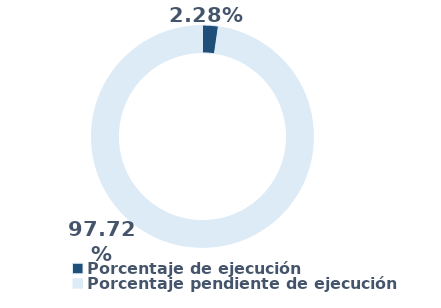
| Category | Series 0 |
|---|---|
| Porcentaje de ejecución | 0.023 |
| Porcentaje pendiente de ejecución | 0.977 |